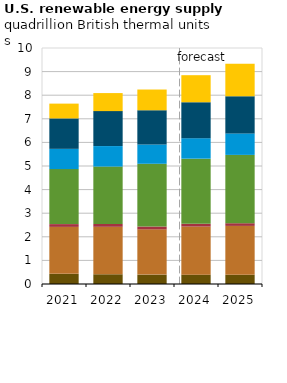
| Category | Other biomass | Wood biomass | Geothermal | Liquid biofuels | Hydropower | Wind power | Solar |
|---|---|---|---|---|---|---|---|
| 2021.0 | 0.43 | 1.989 | 0.118 | 2.331 | 0.858 | 1.289 | 0.627 |
| 2022.0 | 0.412 | 2.012 | 0.118 | 2.433 | 0.869 | 1.481 | 0.765 |
| 2023.0 | 0.398 | 1.918 | 0.12 | 2.659 | 0.818 | 1.45 | 0.878 |
| 2024.0 | 0.395 | 2.04 | 0.117 | 2.759 | 0.868 | 1.524 | 1.146 |
| 2025.0 | 0.39 | 2.071 | 0.114 | 2.895 | 0.912 | 1.569 | 1.378 |